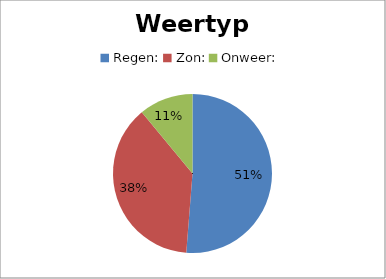
| Category | Weertype |
|---|---|
| Regen: | 0.512 |
| Zon: | 0.378 |
| Onweer: | 0.11 |